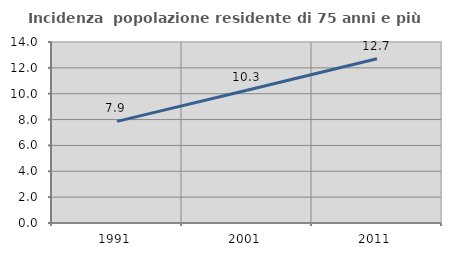
| Category | Incidenza  popolazione residente di 75 anni e più |
|---|---|
| 1991.0 | 7.859 |
| 2001.0 | 10.269 |
| 2011.0 | 12.708 |